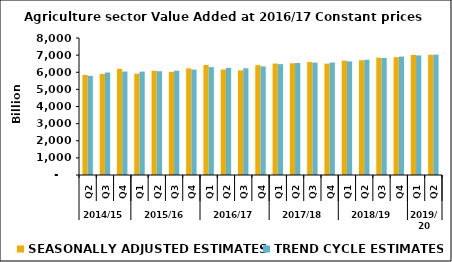
| Category | SEASONALLY ADJUSTED ESTIMATES | TREND CYCLE ESTIMATES |
|---|---|---|
| 0 | 5840.556 | 5792.286 |
| 1 | 5901.558 | 5984.475 |
| 2 | 6199.418 | 6042.573 |
| 3 | 5917.385 | 6037.062 |
| 4 | 6087.851 | 6060.865 |
| 5 | 6025.501 | 6088.36 |
| 6 | 6226.542 | 6152.623 |
| 7 | 6426.903 | 6301.111 |
| 8 | 6165.11 | 6253.16 |
| 9 | 6111.108 | 6233.935 |
| 10 | 6419.087 | 6342.257 |
| 11 | 6506.548 | 6472.618 |
| 12 | 6522.872 | 6541.805 |
| 13 | 6599.185 | 6561.125 |
| 14 | 6504.651 | 6569.683 |
| 15 | 6678.826 | 6632.087 |
| 16 | 6696.278 | 6729.292 |
| 17 | 6850.737 | 6835.07 |
| 18 | 6881.471 | 6914.442 |
| 19 | 7011.038 | 6983.561 |
| 20 | 7021.75 | 7027.588 |